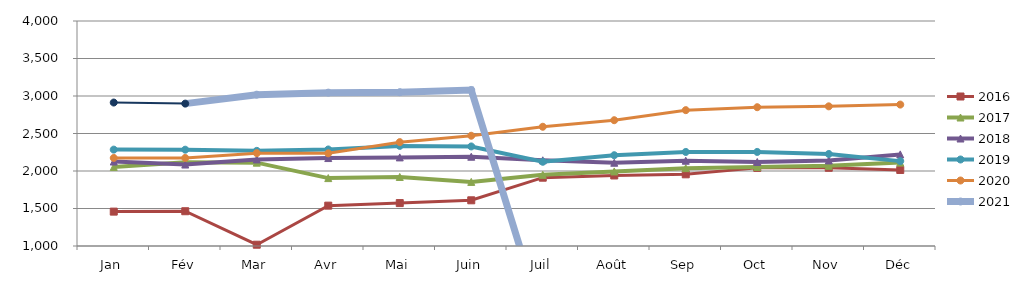
| Category | 2015 | 2016 | 2017 | 2018 | 2019 | 2020 | 2021 |
|---|---|---|---|---|---|---|---|
| Jan |  | 1458.367 | 2054.548 | 2126.43 | 2285.077 | 2174.068 | 2912.819 |
| Fév |  | 1463.569 | 2115.464 | 2086.116 | 2284.041 | 2173.963 | 2898.489 |
| Mar |  | 1017.2 | 2111.342 | 2154.19 | 2268.401 | 2238.064 | 3017.436 |
| Avr |  | 1538.072 | 1905.351 | 2172.692 | 2286.951 | 2235.688 | 3044.815 |
| Mai |  | 1572.182 | 1920.479 | 2181.426 | 2334.869 | 2384.721 | 3050.874 |
| Juin |  | 1609.355 | 1854.713 | 2190.216 | 2327.493 | 2470.094 | 3080.307 |
| Juil |  | 1910.74 | 1949.204 | 2142.84 | 2123.041 | 2589.895 | 0 |
| Août |  | 1940.578 | 1993.991 | 2110.076 | 2210.394 | 2677.173 | 0 |
| Sep |  | 1955.778 | 2037.81 | 2137.072 | 2253.916 | 2811.251 | 0 |
| Oct |  | 2041.667 | 2053.581 | 2119.873 | 2254.192 | 2850.494 | 0 |
| Nov |  | 2042.699 | 2069.345 | 2140.872 | 2226.879 | 2862.02 | 0 |
| Déc |  | 2013.752 | 2111.996 | 2221.568 | 2131.58 | 2885.572 | 0 |